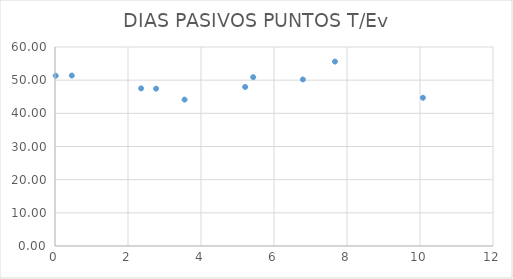
| Category | Series 0 |
|---|---|
| 0.01999999999999602 | 51.34 |
| 0.46000000000000085 | 51.391 |
| 7.669999999999995 | 55.606 |
| 2.769999999999996 | 47.434 |
| 5.210000000000001 | 47.948 |
| 3.5500000000000007 | 44.138 |
| 6.789999999999999 | 50.209 |
| 5.43 | 50.898 |
| 2.3599999999999994 | 47.516 |
| 10.079999999999998 | 44.687 |